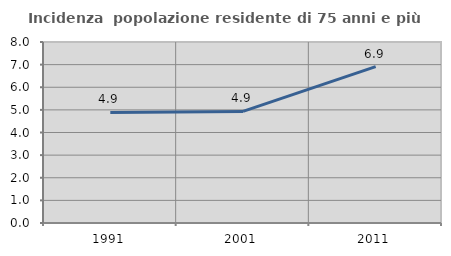
| Category | Incidenza  popolazione residente di 75 anni e più |
|---|---|
| 1991.0 | 4.887 |
| 2001.0 | 4.931 |
| 2011.0 | 6.914 |